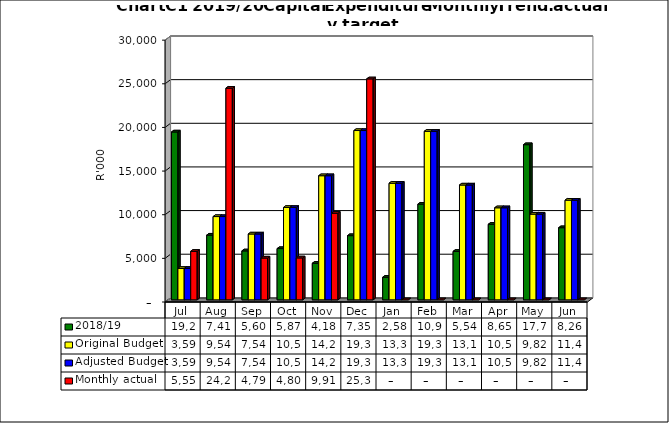
| Category | 2018/19 | Original Budget | Adjusted Budget | Monthly actual |
|---|---|---|---|---|
| Jul | 19231011.37 | 3597000 | 3597000 | 5554740.23 |
| Aug | 7413792.52 | 9540000 | 9540000 | 24246351.16 |
| Sep | 5606695.82 | 7545000 | 7545000 | 4790238.71 |
| Oct | 5872546.52 | 10583000 | 10583000 | 4804471.47 |
| Nov | 4185356.82 | 14220000 | 14220000 | 9915031.46 |
| Dec | 7353836.19 | 19396000 | 19396000 | 25314667.42 |
| Jan | 2583015.59 | 13356000 | 13356000 | 0 |
| Feb | 10959701.7 | 19309000 | 19309000 | 0 |
| Mar | 5548374.54 | 13155000 | 13155000 | 0 |
| Apr | 8654474.54 | 10547000 | 10547000 | 0 |
| May | 17774802.17 | 9821000 | 9821000 | 0 |
| Jun | 8264280 | 11417000 | 11417000 | 0 |